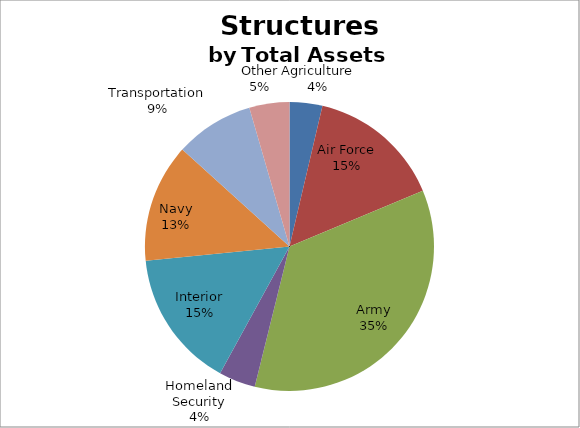
| Category | Series 0 |
|---|---|
| Agriculture | 17826 |
| Air Force | 73055 |
| Army | 170850 |
| Homeland Security | 19948 |
| Interior | 75097 |
| Navy | 64477 |
| Transportation | 42829 |
| Other | 21784 |